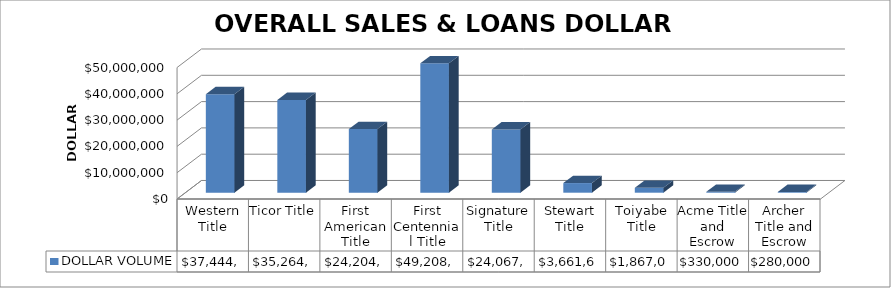
| Category | DOLLAR VOLUME |
|---|---|
| Western Title | 37444394 |
| Ticor Title | 35264092 |
| First American Title | 24204241 |
| First Centennial Title | 49208649 |
| Signature Title | 24067640 |
| Stewart Title | 3661685 |
| Toiyabe Title | 1867000 |
| Acme Title and Escrow | 330000 |
| Archer Title and Escrow | 280000 |